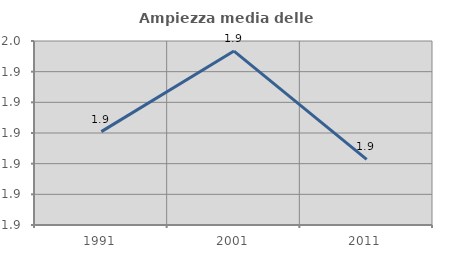
| Category | Ampiezza media delle famiglie |
|---|---|
| 1991.0 | 1.92 |
| 2001.0 | 1.947 |
| 2011.0 | 1.911 |